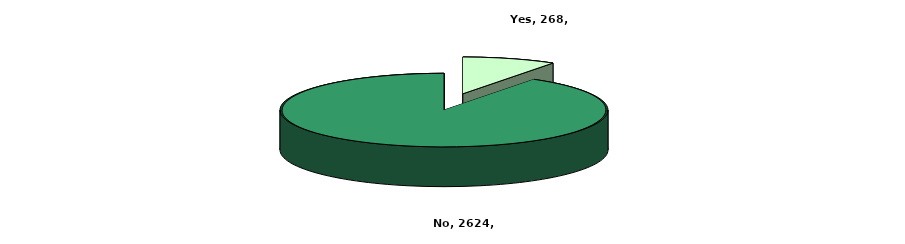
| Category | Series 0 |
|---|---|
| Yes | 268 |
| No | 2624 |